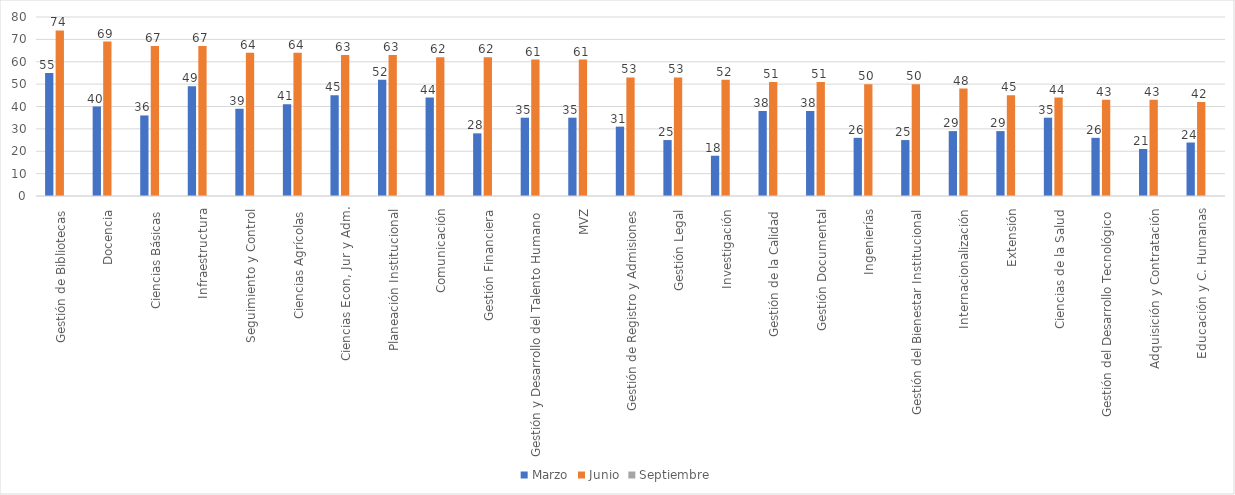
| Category | Marzo | Junio | Septiembre |
|---|---|---|---|
| Gestión de Bibliotecas | 55 | 74 |  |
| Docencia | 40 | 69 |  |
| Ciencias Básicas | 36 | 67 |  |
| Infraestructura | 49 | 67 |  |
| Seguimiento y Control | 39 | 64 |  |
| Ciencias Agrícolas | 41 | 64 |  |
| Ciencias Econ, Jur y Adm. | 45 | 63 |  |
| Planeación Institucional | 52 | 63 |  |
| Comunicación | 44 | 62 |  |
| Gestión Financiera | 28 | 62 |  |
| Gestión y Desarrollo del Talento Humano | 35 | 61 |  |
| MVZ | 35 | 61 |  |
| Gestión de Registro y Admisiones | 31 | 53 |  |
| Gestión Legal | 25 | 53 |  |
| Investigación | 18 | 52 |  |
| Gestión de la Calidad | 38 | 51 |  |
| Gestión Documental | 38 | 51 |  |
| Ingenierías | 26 | 50 |  |
| Gestión del Bienestar Institucional | 25 | 50 |  |
| Internacionalización | 29 | 48 |  |
| Extensión | 29 | 45 |  |
| Ciencias de la Salud | 35 | 44 |  |
| Gestión del Desarrollo Tecnológico | 26 | 43 |  |
| Adquisición y Contratación | 21 | 43 |  |
| Educación y C. Humanas | 23.9 | 42 |  |